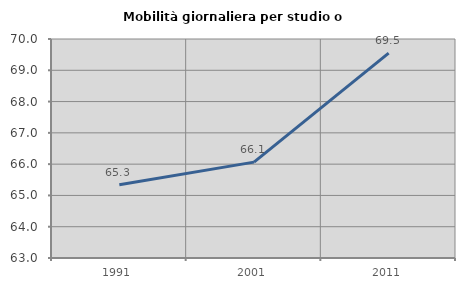
| Category | Mobilità giornaliera per studio o lavoro |
|---|---|
| 1991.0 | 65.344 |
| 2001.0 | 66.064 |
| 2011.0 | 69.549 |